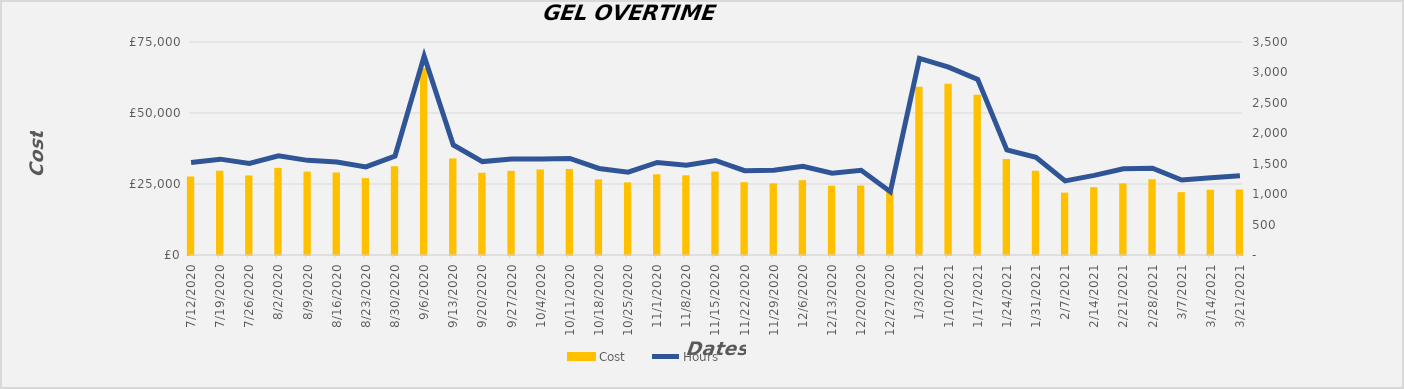
| Category | Cost |
|---|---|
| 7/12/20 | 26575.468 |
| 7/19/20 | 28623.307 |
| 7/26/20 | 26943.632 |
| 8/2/20 | 29631.261 |
| 8/9/20 | 28309.93 |
| 8/16/20 | 27996.413 |
| 8/23/20 | 26001.448 |
| 8/30/20 | 30206.164 |
| 9/6/20 | 64816.101 |
| 9/13/20 | 32965.082 |
| 9/20/20 | 27897.002 |
| 9/27/20 | 28568.439 |
| 10/4/20 | 29060.122 |
| 10/11/20 | 29242.612 |
| 10/18/20 | 25556.361 |
| 10/25/20 | 24514.315 |
| 11/1/20 | 27371.528 |
| 11/8/20 | 27010.226 |
| 11/15/20 | 28332.74 |
| 11/22/20 | 24573.615 |
| 11/29/20 | 24172.174 |
| 12/6/20 | 25288.796 |
| 12/13/20 | 23345.21 |
| 12/20/20 | 23409.664 |
| 12/27/20 | 21289.604 |
| 1/3/21 | 58194.015 |
| 1/10/21 | 59271.991 |
| 1/17/21 | 55391.829 |
| 1/24/21 | 32759.912 |
| 1/31/21 | 28623.55 |
| 2/7/21 | 20903.758 |
| 2/14/21 | 22837.828 |
| 2/21/21 | 24171.13 |
| 2/28/21 | 25614.265 |
| 3/7/21 | 21069.354 |
| 3/14/21 | 21917.257 |
| 3/21/21 | 22040.463 |